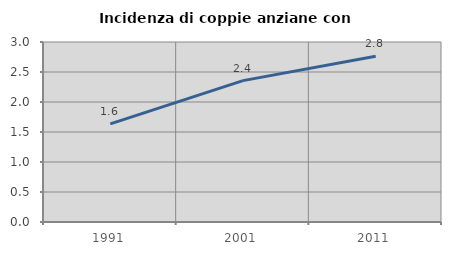
| Category | Incidenza di coppie anziane con figli |
|---|---|
| 1991.0 | 1.635 |
| 2001.0 | 2.356 |
| 2011.0 | 2.761 |